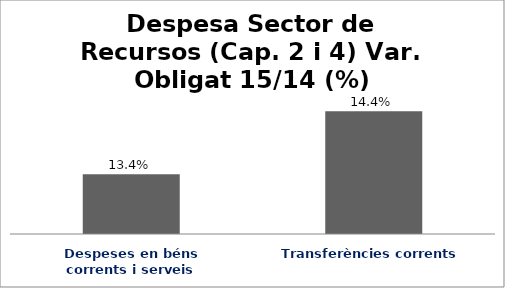
| Category | Series 0 |
|---|---|
| Despeses en béns corrents i serveis | 0.134 |
| Transferències corrents | 0.144 |